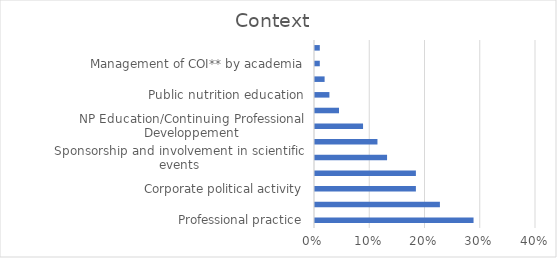
| Category | % |
|---|---|
| Professional practice | 0.287 |
| Sponsorship of professional body/organization | 0.226 |
| Corporate political activity | 0.183 |
| Partnership/collaboration with professional body | 0.183 |
| Sponsorship and involvement in scientific events | 0.13 |
| Management of COI** by professional body/nutrition organization | 0.113 |
| NP Education/Continuing Professional Developpement | 0.087 |
| Ethics | 0.043 |
| Public nutrition education | 0.026 |
| Sponsorship of health professional | 0.017 |
| Management of COI** by academia | 0.009 |
| Sponsorship/advertising | 0.009 |